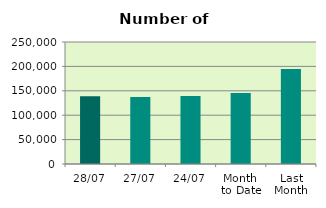
| Category | Series 0 |
|---|---|
| 28/07 | 138748 |
| 27/07 | 137376 |
| 24/07 | 139320 |
| Month 
to Date | 145690.4 |
| Last
Month | 194460.727 |